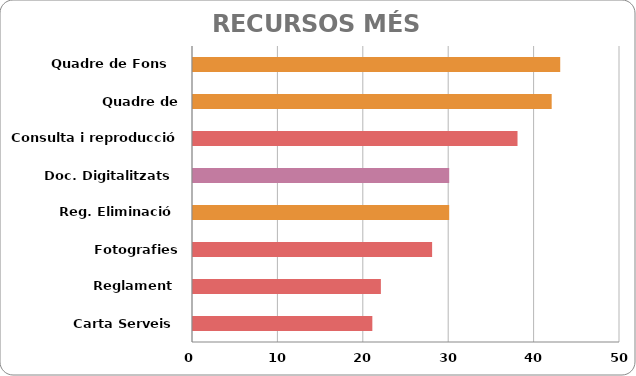
| Category | Series 0 |
|---|---|
| Quadre de Fons  | 43 |
| Quadre de classificació  | 42 |
| Consulta i reproducció | 38 |
| Doc. Digitalitzats | 30 |
| Reg. Eliminació | 30 |
| Fotografies equipament  | 28 |
| Reglament | 22 |
| Carta Serveis | 21 |